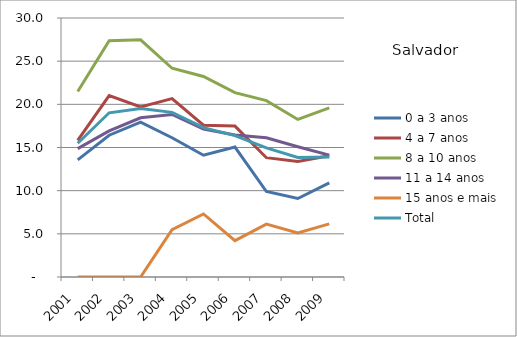
| Category | 0 a 3 anos | 4 a 7 anos | 8 a 10 anos | 11 a 14 anos | 15 anos e mais | Total |
|---|---|---|---|---|---|---|
| 2001.0 | 13.57 | 15.83 | 21.49 | 14.87 | 0 | 15.49 |
| 2002.0 | 16.42 | 21.01 | 27.36 | 16.93 | 0 | 19.02 |
| 2003.0 | 17.94 | 19.7 | 27.47 | 18.44 | 0 | 19.53 |
| 2004.0 | 16.13 | 20.67 | 24.18 | 18.83 | 5.47 | 19.07 |
| 2005.0 | 14.1 | 17.58 | 23.23 | 17.14 | 7.3 | 17.3 |
| 2006.0 | 15.05 | 17.48 | 21.35 | 16.46 | 4.21 | 16.38 |
| 2007.0 | 9.9 | 13.82 | 20.43 | 16.12 | 6.13 | 14.96 |
| 2008.0 | 9.09 | 13.38 | 18.25 | 15.09 | 5.11 | 13.84 |
| 2009.0 | 10.9 | 14.05 | 19.59 | 14.12 | 6.16 | 13.9 |